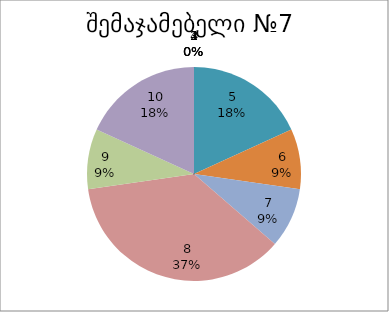
| Category | რაოდენობა | ქულა |
|---|---|---|
| 0 | 0 | 1 |
| 1 | 0 | 2 |
| 2 | 0 | 3 |
| 3 | 0 | 4 |
| 4 | 2 | 5 |
| 5 | 1 | 6 |
| 6 | 1 | 7 |
| 7 | 4 | 8 |
| 8 | 1 | 9 |
| 9 | 2 | 10 |